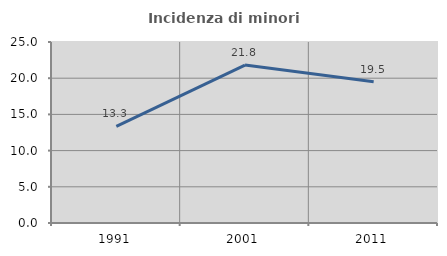
| Category | Incidenza di minori stranieri |
|---|---|
| 1991.0 | 13.333 |
| 2001.0 | 21.818 |
| 2011.0 | 19.512 |